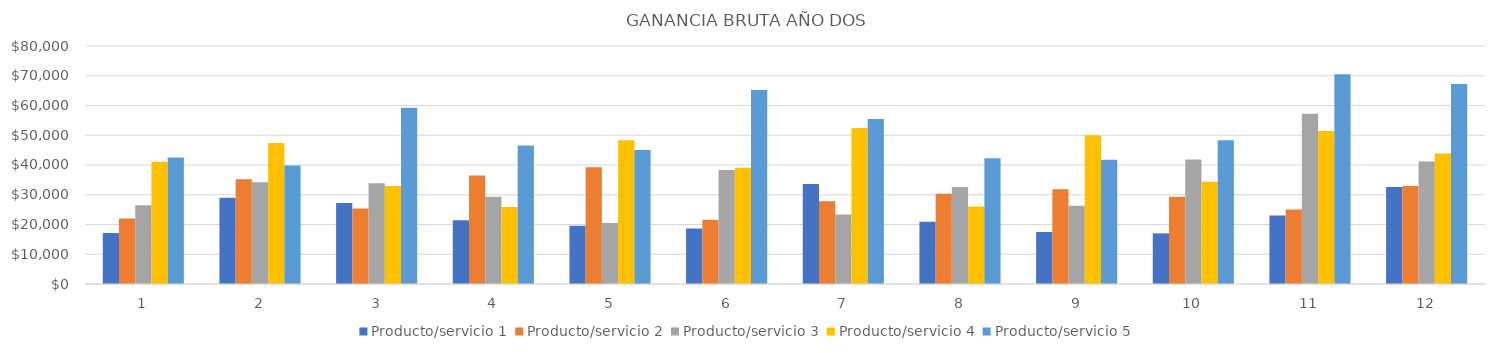
| Category | Producto/servicio 1 | Producto/servicio 2 | Producto/servicio 3 | Producto/servicio 4 | Producto/servicio 5 |
|---|---|---|---|---|---|
| 0 | 17167.8 | 21992.6 | 26467 | 41126.4 | 42546 |
| 1 | 28975.1 | 35202.65 | 34178.4 | 47385.9 | 39830 |
| 2 | 27264 | 25397.75 | 33852 | 32945 | 59276 |
| 3 | 21413.6 | 36433.8 | 29356.6 | 25861.5 | 46578 |
| 4 | 19574.7 | 39261.6 | 20536 | 48289.5 | 45010 |
| 5 | 18637.5 | 21563.4 | 38322 | 39049.5 | 65212 |
| 6 | 33575.9 | 27828.85 | 23328 | 52448 | 55468 |
| 7 | 20959.2 | 30360 | 32580 | 26026 | 42238 |
| 8 | 17437.6 | 31848 | 26289 | 49962 | 41748 |
| 9 | 17017 | 29310.05 | 41841 | 34386 | 48356 |
| 10 | 23032.1 | 25074.75 | 57220.9 | 51454 | 70490 |
| 11 | 32578 | 32910 | 41140 | 43836 | 67192 |